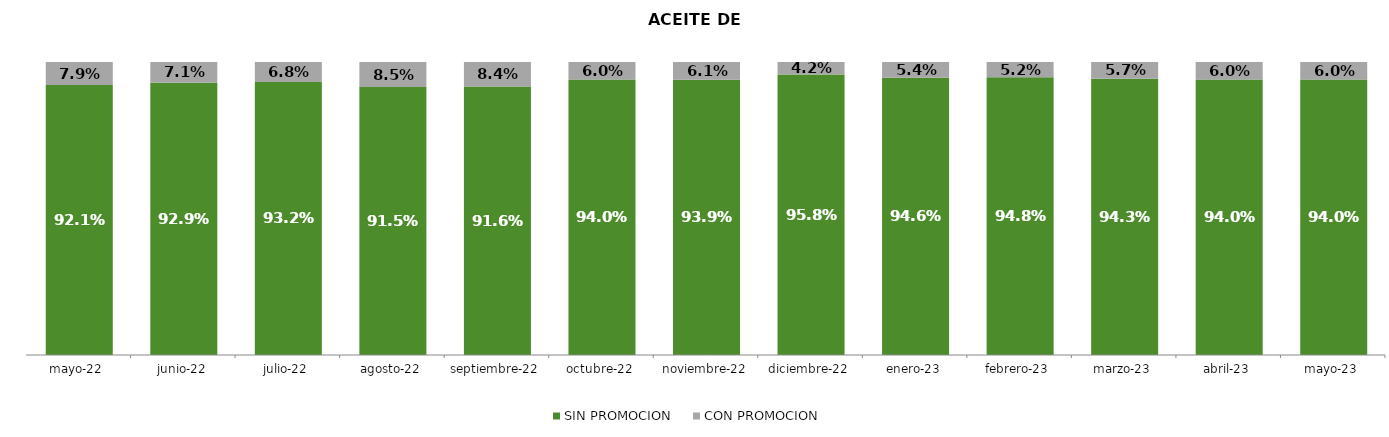
| Category | SIN PROMOCION   | CON PROMOCION   |
|---|---|---|
| 2022-05-01 | 0.921 | 0.079 |
| 2022-06-01 | 0.929 | 0.071 |
| 2022-07-01 | 0.932 | 0.068 |
| 2022-08-01 | 0.915 | 0.085 |
| 2022-09-01 | 0.916 | 0.084 |
| 2022-10-01 | 0.94 | 0.06 |
| 2022-11-01 | 0.939 | 0.061 |
| 2022-12-01 | 0.958 | 0.042 |
| 2023-01-01 | 0.946 | 0.054 |
| 2023-02-01 | 0.948 | 0.052 |
| 2023-03-01 | 0.943 | 0.057 |
| 2023-04-01 | 0.94 | 0.06 |
| 2023-05-01 | 0.94 | 0.06 |